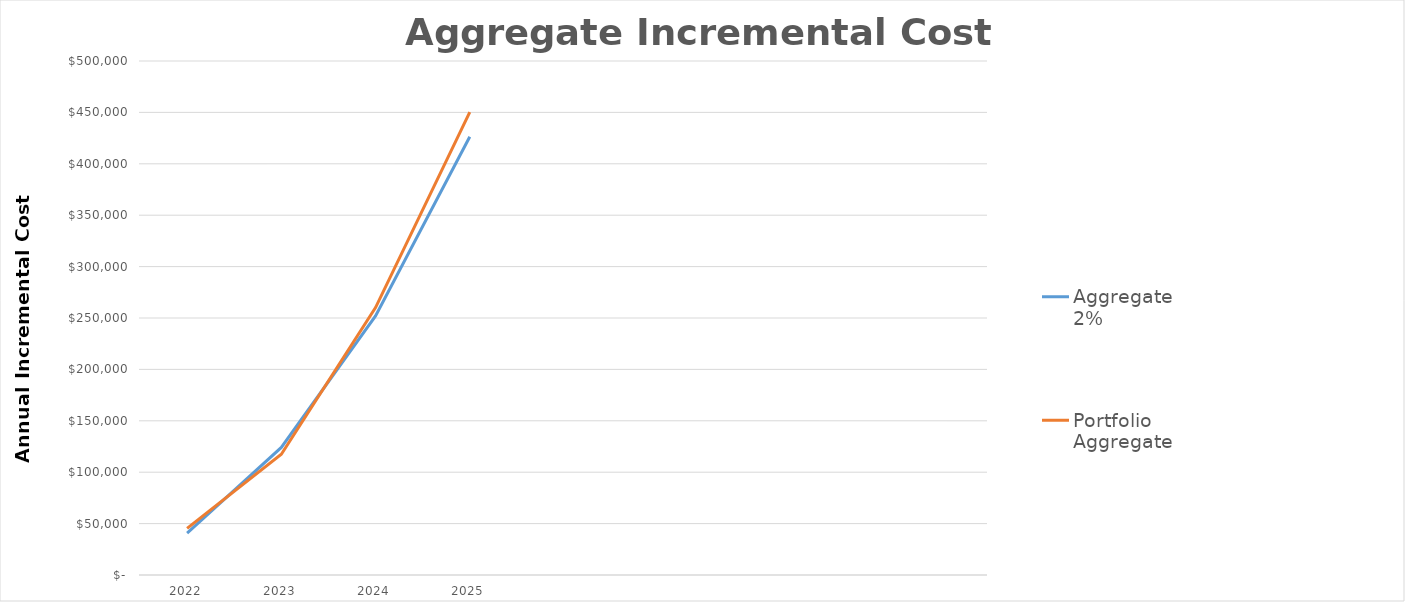
| Category | Aggregate 2% | Portfolio Aggregate |
|---|---|---|
| 2022.0 | 40761 | 45316.501 |
| 2023.0 | 124117.246 | 117498.253 |
| 2024.0 | 251965.143 | 260109.2 |
| 2025.0 | 426265.138 | 450307.361 |